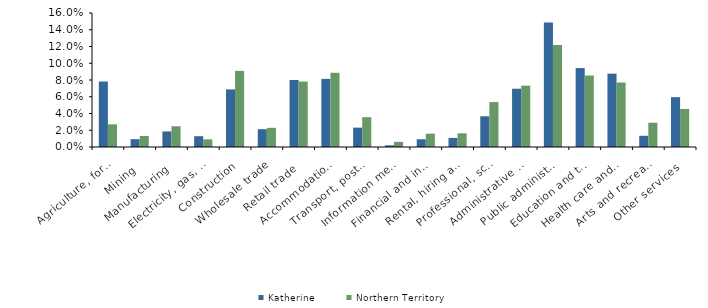
| Category | Katherine | Northern Territory |
|---|---|---|
| Agriculture, forestry and fishing | 0.078 | 0.027 |
| Mining | 0.009 | 0.013 |
| Manufacturing | 0.019 | 0.025 |
| Electricity, gas, water and waste services | 0.013 | 0.009 |
| Construction | 0.069 | 0.091 |
| Wholesale trade | 0.021 | 0.023 |
| Retail trade | 0.08 | 0.078 |
| Accommodation and food services | 0.081 | 0.089 |
| Transport, postal and warehousing | 0.023 | 0.036 |
| Information media and telecommunications | 0.002 | 0.006 |
| Financial and insurance services | 0.009 | 0.016 |
| Rental, hiring and real estate services | 0.011 | 0.016 |
| Professional, scientific and technical services | 0.037 | 0.054 |
| Administrative and support services | 0.07 | 0.073 |
| Public administration and safety | 0.149 | 0.122 |
| Education and training | 0.094 | 0.085 |
| Health care and social assistance | 0.088 | 0.077 |
| Arts and recreation services | 0.013 | 0.029 |
| Other services | 0.06 | 0.045 |